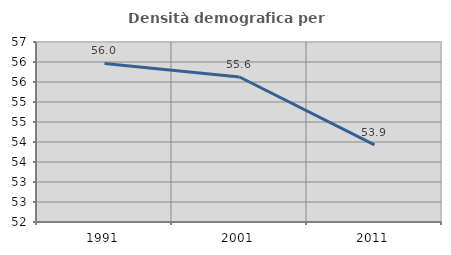
| Category | Densità demografica |
|---|---|
| 1991.0 | 55.965 |
| 2001.0 | 55.625 |
| 2011.0 | 53.93 |